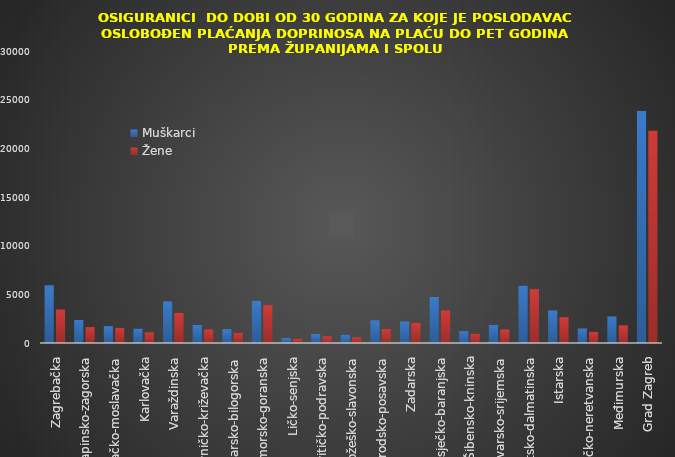
| Category | Muškarci | Žene |
|---|---|---|
| Zagrebačka | 5931 | 3442 |
| Krapinsko-zagorska | 2365 | 1636 |
| Sisačko-moslavačka | 1732 | 1565 |
| Karlovačka | 1488 | 1098 |
| Varaždinska | 4274 | 3105 |
| Koprivničko-križevačka | 1861 | 1401 |
| Bjelovarsko-bilogorska | 1429 | 1039 |
| Primorsko-goranska | 4322 | 3896 |
| Ličko-senjska | 541 | 420 |
| Virovitičko-podravska | 922 | 692 |
| Požeško-slavonska | 860 | 583 |
| Brodsko-posavska | 2333 | 1437 |
| Zadarska | 2212 | 2105 |
| Osječko-baranjska | 4736 | 3352 |
| Šibensko-kninska | 1220 | 974 |
| Vukovarsko-srijemska | 1856 | 1392 |
| Splitsko-dalmatinska | 5906 | 5539 |
| Istarska | 3346 | 2657 |
| Dubrovačko-neretvanska | 1494 | 1156 |
| Međimurska | 2730 | 1819 |
| Grad Zagreb | 23844 | 21830 |